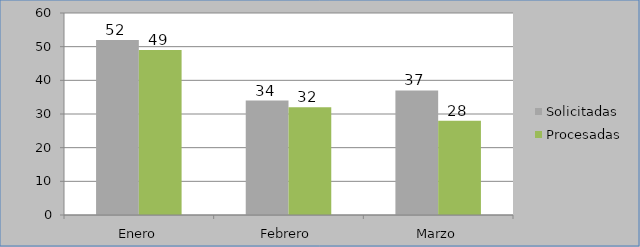
| Category | Solicitadas | Procesadas |
|---|---|---|
| Enero | 52 | 49 |
| Febrero | 34 | 32 |
| Marzo | 37 | 28 |